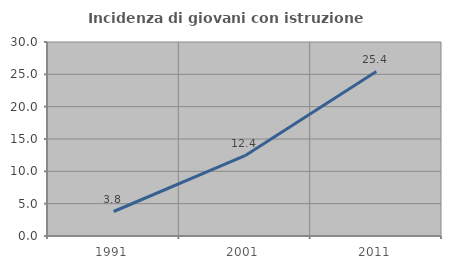
| Category | Incidenza di giovani con istruzione universitaria |
|---|---|
| 1991.0 | 3.788 |
| 2001.0 | 12.422 |
| 2011.0 | 25.424 |